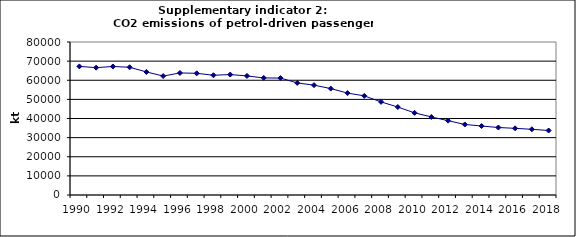
| Category | CO2 emissions of petrol-driven passenger cars, kt |
|---|---|
| 1990 | 67239.48 |
| 1991 | 66585.947 |
| 1992 | 67202.082 |
| 1993 | 66785.893 |
| 1994 | 64347.762 |
| 1995 | 62192.158 |
| 1996 | 63817.911 |
| 1997 | 63619.715 |
| 1998 | 62615.522 |
| 1999 | 62978.543 |
| 2000 | 62267.479 |
| 2001 | 61214.151 |
| 2002 | 61139.258 |
| 2003 | 58589.383 |
| 2004 | 57441.878 |
| 2005 | 55652.217 |
| 2006 | 53296.663 |
| 2007 | 51840.761 |
| 2008 | 48691.871 |
| 2009 | 45996.599 |
| 2010 | 42952.976 |
| 2011 | 40810.876 |
| 2012 | 38870.947 |
| 2013 | 36883.154 |
| 2014 | 36071.504 |
| 2015 | 35288.104 |
| 2016 | 34855.097 |
| 2017 | 34347.06 |
| 2018 | 33728.966 |